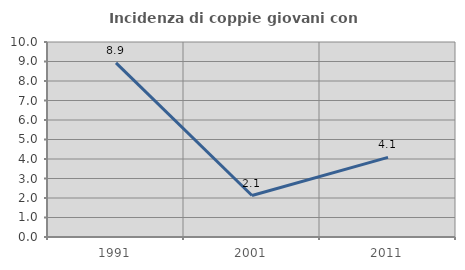
| Category | Incidenza di coppie giovani con figli |
|---|---|
| 1991.0 | 8.929 |
| 2001.0 | 2.128 |
| 2011.0 | 4.082 |